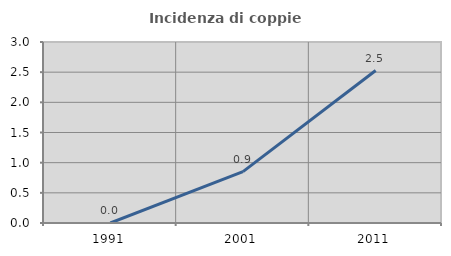
| Category | Incidenza di coppie miste |
|---|---|
| 1991.0 | 0 |
| 2001.0 | 0.851 |
| 2011.0 | 2.527 |